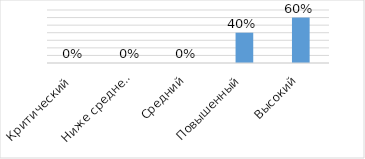
| Category | Series 0 |
|---|---|
| Критический  | 0 |
| Ниже среднего | 0 |
| Средний | 0 |
| Повышенный | 0.4 |
| Высокий | 0.6 |